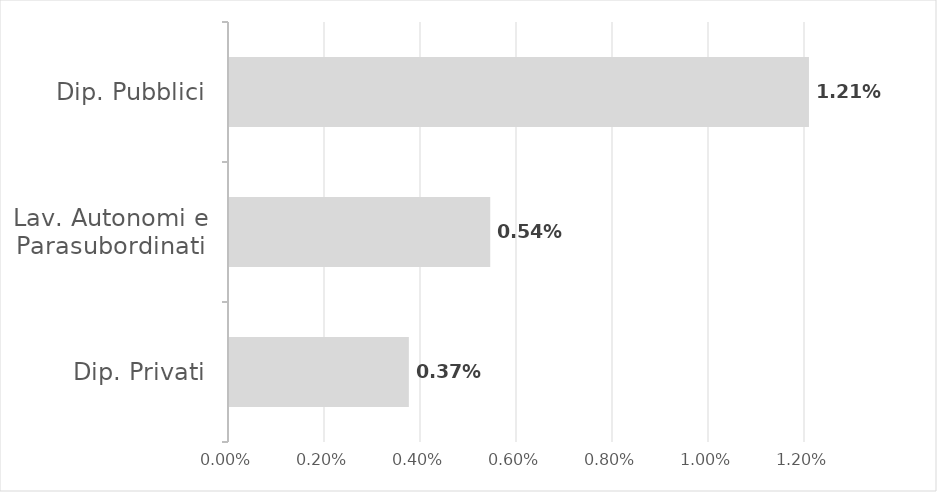
| Category | Series 0 |
|---|---|
| Dip. Privati | 0.004 |
| Lav. Autonomi e Parasubordinati | 0.005 |
| Dip. Pubblici | 0.012 |